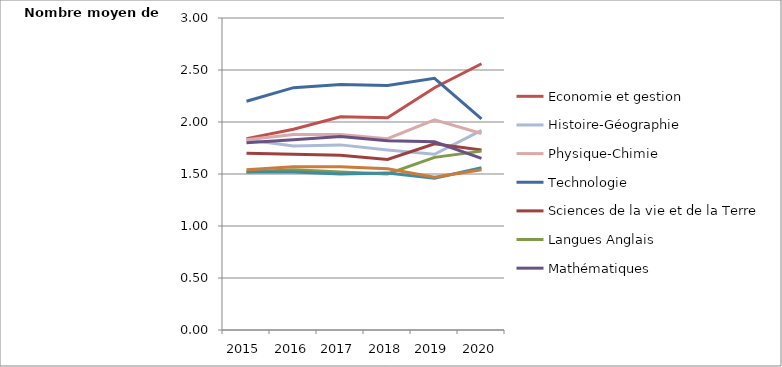
| Category | Economie et gestion | Histoire-Géographie | Physique-Chimie | Technologie | Sciences de la vie et de la Terre | Langues Anglais | Mathématiques | Lettres | Sciences économiques et sociales |
|---|---|---|---|---|---|---|---|---|---|
| 2015 | 1.84 | 1.83 | 1.83 | 2.2 | 1.7 | 1.52 | 1.8 | 1.52 | 1.54 |
| 2016 | 1.93 | 1.77 | 1.88 | 2.33 | 1.69 | 1.54 | 1.83 | 1.52 | 1.57 |
| 2017 | 2.05 | 1.78 | 1.88 | 2.36 | 1.68 | 1.52 | 1.86 | 1.5 | 1.57 |
| 2018 | 2.04 | 1.73 | 1.84 | 2.35 | 1.64 | 1.5 | 1.82 | 1.51 | 1.55 |
| 2019 | 2.33 | 1.69 | 2.02 | 2.42 | 1.79 | 1.66 | 1.81 | 1.46 | 1.47 |
| 2020 | 2.56 | 1.92 | 1.89 | 2.03 | 1.73 | 1.72 | 1.65 | 1.56 | 1.54 |